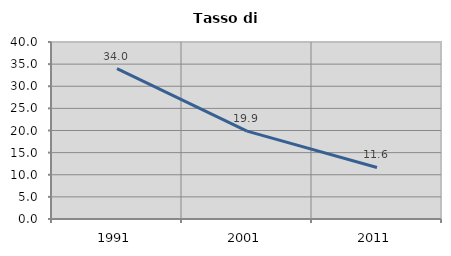
| Category | Tasso di disoccupazione   |
|---|---|
| 1991.0 | 33.979 |
| 2001.0 | 19.861 |
| 2011.0 | 11.648 |